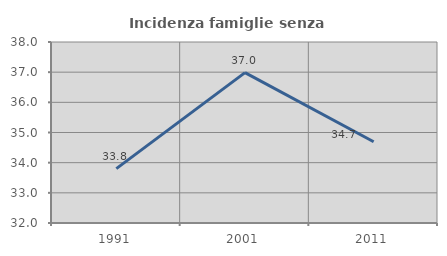
| Category | Incidenza famiglie senza nuclei |
|---|---|
| 1991.0 | 33.803 |
| 2001.0 | 36.986 |
| 2011.0 | 34.694 |